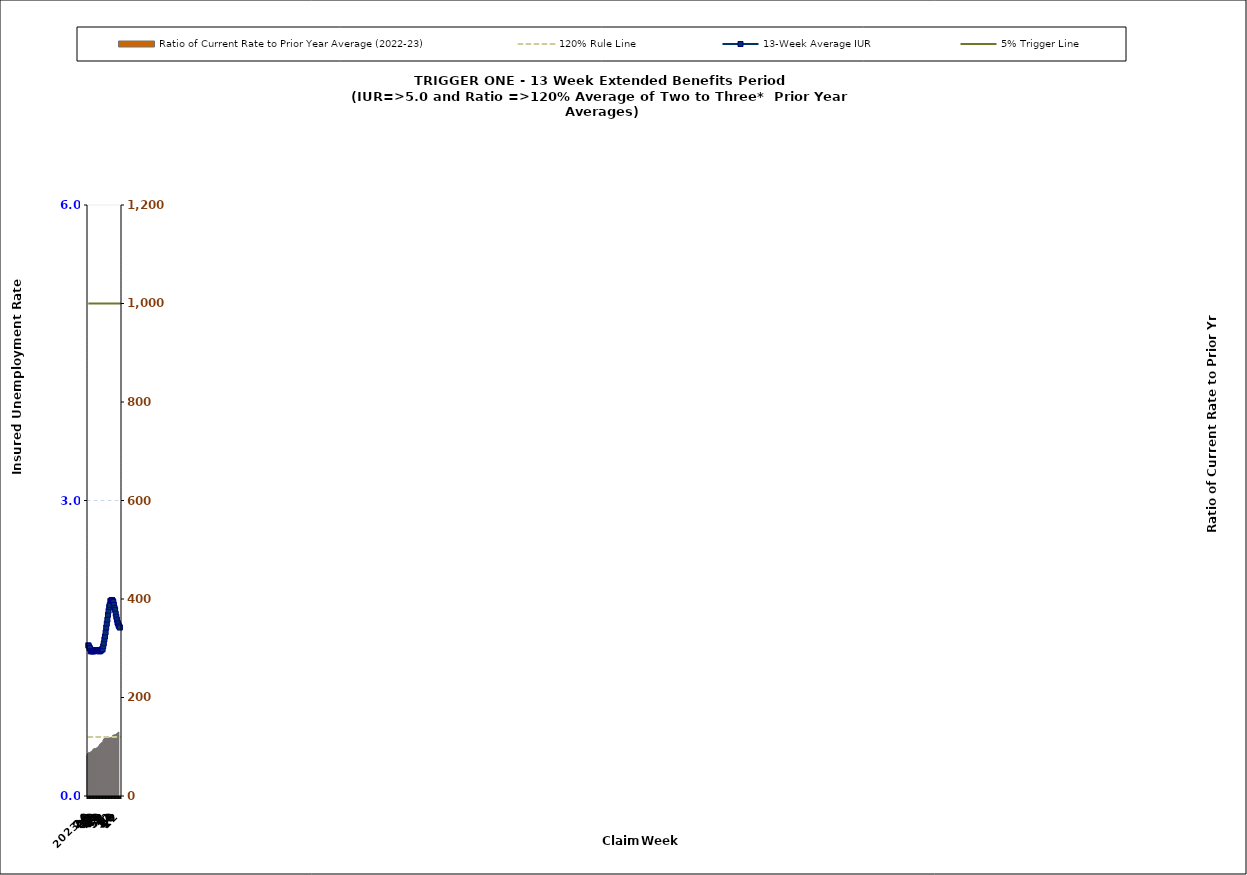
| Category | Ratio of Current Rate to Prior Year Average (2022-23) |
|---|---|
| 2023-22 | 83.37 |
| 2023-23 | 86.11 |
| 24 | 87.2 |
| 25 | 88.75 |
| 26 | 87.5 |
| 27 | 88.82 |
| 28 | 89.63 |
| 29 | 90.18 |
| 30 | 90.74 |
| 31 | 93.03 |
| 32 | 94.53 |
| 33 | 95.79 |
| 34 | 96.1 |
| 35 | 97.04 |
| 36 | 96.1 |
| 37 | 96.41 |
| 38 | 97.68 |
| 39 | 98.33 |
| 40 | 98.98 |
| 41 | 100.68 |
| 42 | 102.08 |
| 43 | 104.22 |
| 44 | 105.71 |
| 45 | 106.81 |
| 46 | 107.97 |
| 47 | 108.57 |
| 48 | 109.54 |
| 49 | 113.57 |
| 50 | 115.71 |
| 51 | 116.9 |
| 52 | 117.52 |
| 1 | 117.44 |
| 2 | 116.99 |
| 3 | 117.94 |
| 4 | 117.86 |
| 5 | 118.15 |
| 6 | 118.29 |
| 7 | 118.2 |
| 8 | 117.85 |
| 9 | 118.45 |
| 10 | 118.8 |
| 11 | 118.91 |
| 12 | 119.75 |
| 13 | 122.78 |
| 14 | 123.22 |
| 15 | 124.34 |
| 16 | 124.16 |
| 17 | 124.65 |
| 18 | 125.17 |
| 19 | 125.26 |
| 20 | 126.81 |
| 21 | 127.67 |
| 22 | 129.32 |
| 2024-23 | 130.03 |